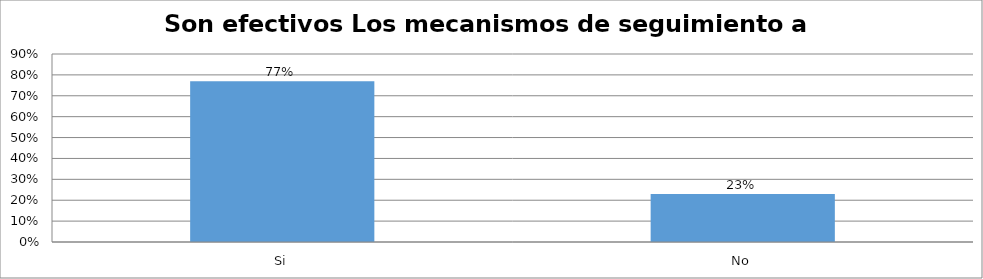
| Category | Series 0 |
|---|---|
| Si | 0.77 |
| No | 0.23 |